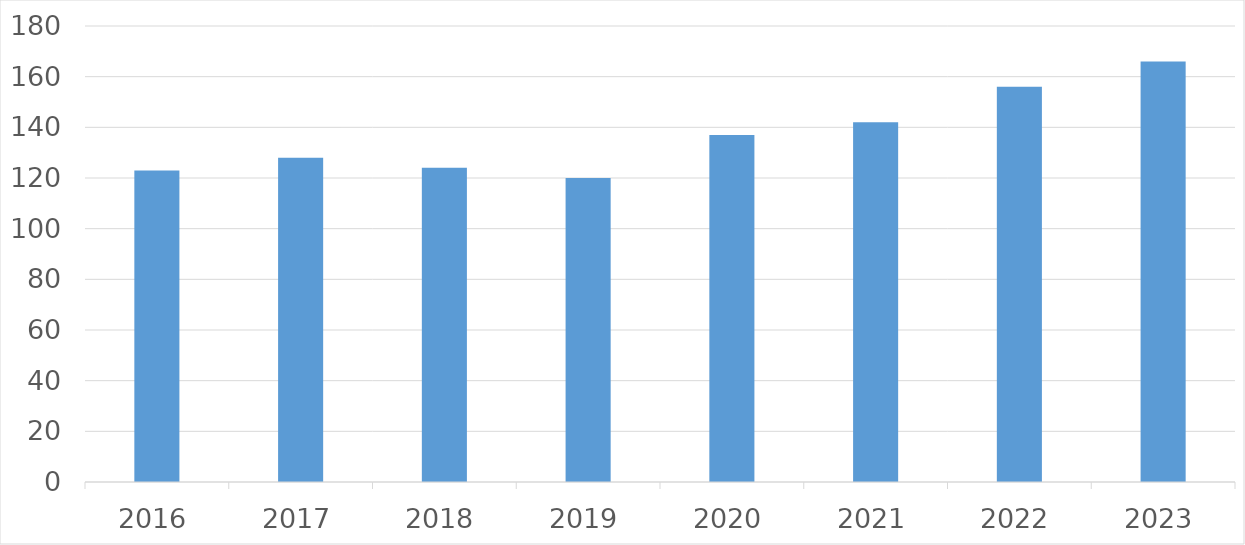
| Category | Series 0 |
|---|---|
| 2016 | 123 |
| 2017 | 128 |
| 2018 | 124 |
| 2019 | 120 |
| 2020 | 137 |
| 2021 | 142 |
| 2022 | 156 |
| 2023 | 166 |